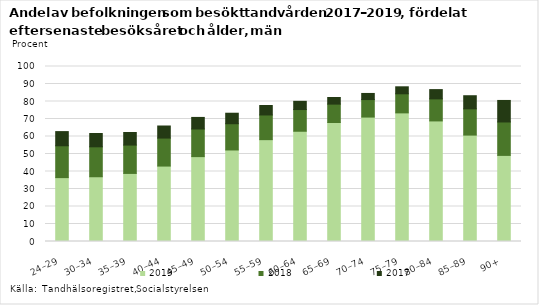
| Category | 2019 | 2018 | 2017 |
|---|---|---|---|
| 24–29 | 36.5 | 18.2 | 8.1 |
| 30–34 | 37 | 17.1 | 7.6 |
| 35–39 | 38.9 | 16.2 | 7.2 |
| 40–44 | 43.1 | 16 | 6.9 |
| 45–49 | 48.5 | 15.8 | 6.6 |
| 50–54 | 52.3 | 15 | 6 |
| 55–59 | 58.2 | 14.1 | 5.4 |
| 60–64 | 63 | 12.4 | 4.7 |
| 65–69 | 68 | 10.5 | 3.8 |
| 70–74 | 71.1 | 10 | 3.5 |
| 75–79 | 73.5 | 10.9 | 4 |
| 80–84 | 68.9 | 12.6 | 5.3 |
| 85–89 | 60.8 | 15 | 7.5 |
| 90+ | 49.2 | 19.1 | 12.3 |